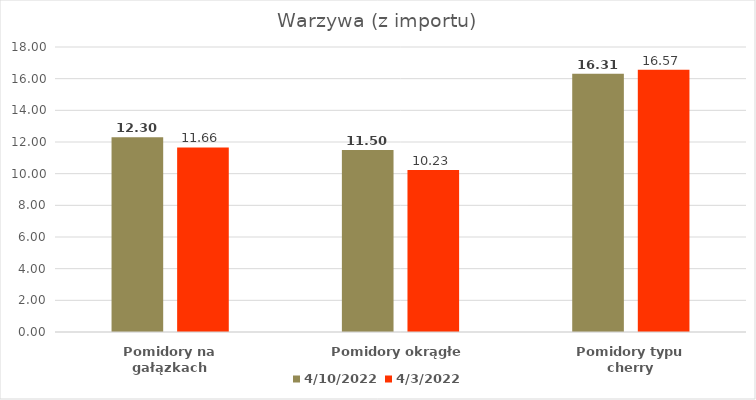
| Category | 10.04.2022 | 03.04.2022 |
|---|---|---|
| Pomidory na gałązkach | 12.3 | 11.66 |
| Pomidory okrągłe | 11.5 | 10.23 |
| Pomidory typu cherry | 16.31 | 16.57 |